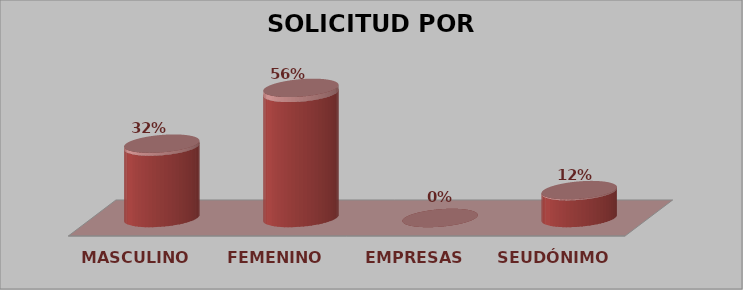
| Category | SOLICITUD POR GÉNERO | Series 1 |
|---|---|---|
| MASCULINO | 8 | 0.32 |
| FEMENINO | 14 | 0.56 |
| EMPRESAS | 0 | 0 |
| SEUDÓNIMO | 3 | 0.12 |